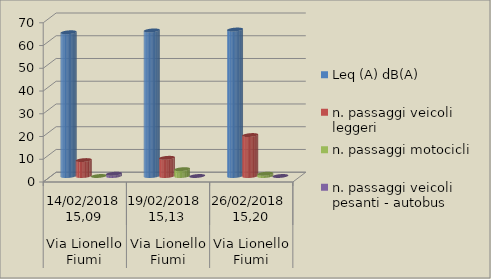
| Category | Leq (A) dB(A) | n. passaggi veicoli leggeri  | n. passaggi motocicli | n. passaggi veicoli pesanti - autobus  |
|---|---|---|---|---|
| 0 | 63.2 | 7 | 0 | 1 |
| 1 | 64 | 8 | 3 | 0 |
| 2 | 64.4 | 18 | 1 | 0 |